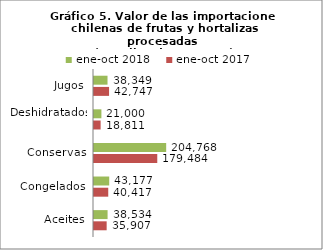
| Category | ene-oct 2017 | ene-oct 2018 |
|---|---|---|
| Aceites | 35907275.4 | 38534027.34 |
| Congelados | 40416807.34 | 43177206.46 |
| Conservas | 179483899.66 | 204767729.07 |
| Deshidratados | 18810757.86 | 20999685.3 |
| Jugos | 42747485.26 | 38349265.39 |